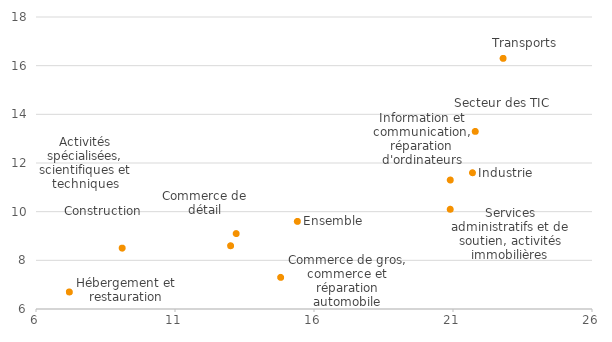
| Category | Taux d’utilisation des systèmes interconnectés |
|---|---|
| 22.8 | 16.3 |
| 21.7 | 11.6 |
| 20.9 | 11.3 |
| 20.9 | 10.1 |
| 13.2 | 9.1 |
| 13.0 | 8.6 |
| 9.1 | 8.5 |
| 14.8 | 7.3 |
| 7.2 | 6.7 |
| 15.4 | 9.6 |
| 21.8 | 13.3 |